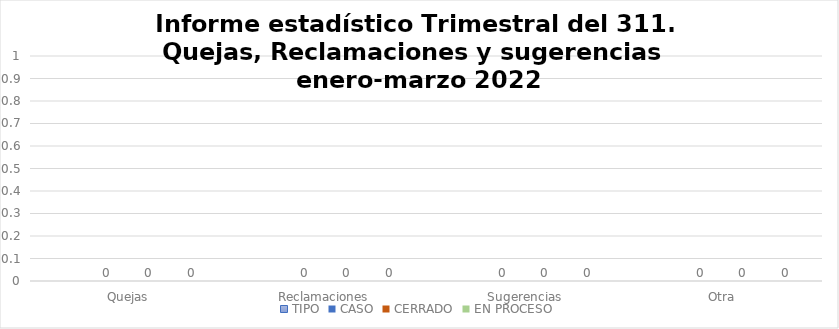
| Category | TIPO | CASO | CERRADO | EN PROCESO |
|---|---|---|---|---|
| Quejas |  | 0 | 0 | 0 |
| Reclamaciones  |  | 0 | 0 | 0 |
| Sugerencias |  | 0 | 0 | 0 |
| Otra |  | 0 | 0 | 0 |